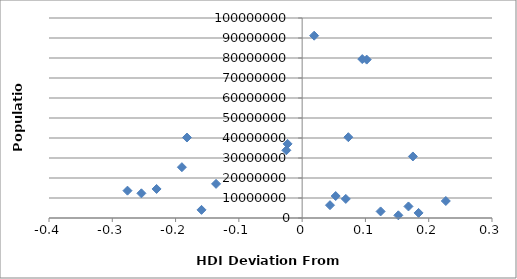
| Category | Population |
|---|---|
| 0.018999999999999906 | 91162000 |
| 0.17499999999999993 | 30770375 |
| 0.06899999999999995 | 9531712 |
| 0.22699999999999998 | 8502900 |
| -0.136 | 17064854 |
| -0.02300000000000002 | 37056169 |
| 0.10199999999999998 | 79200000 |
| 0.09499999999999997 | 79463663 |
| 0.16799999999999993 | 5779760 |
| 0.124 | 3286936 |
| -0.19000000000000006 | 25408000 |
| 0.18399999999999994 | 2545603 |
| 0.1519999999999999 | 1343000 |
| 0.04399999999999993 | 6411776 |
| 0.07299999999999995 | 40400000 |
| -0.18200000000000005 | 40235000 |
| -0.25400000000000006 | 12340000 |
| -0.025000000000000022 | 33848242 |
| 0.052999999999999936 | 10982754 |
| -0.15900000000000003 | 4067564 |
| -0.23000000000000004 | 14517176 |
| -0.276 | 13670084 |